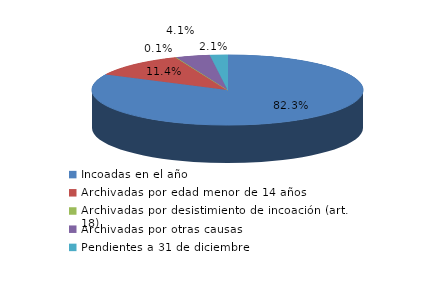
| Category | Series 0 |
|---|---|
| Incoadas en el año | 870 |
| Archivadas por edad menor de 14 años | 121 |
| Archivadas por desistimiento de incoación (art. 18) | 1 |
| Archivadas por otras causas | 43 |
| Pendientes a 31 de diciembre | 22 |